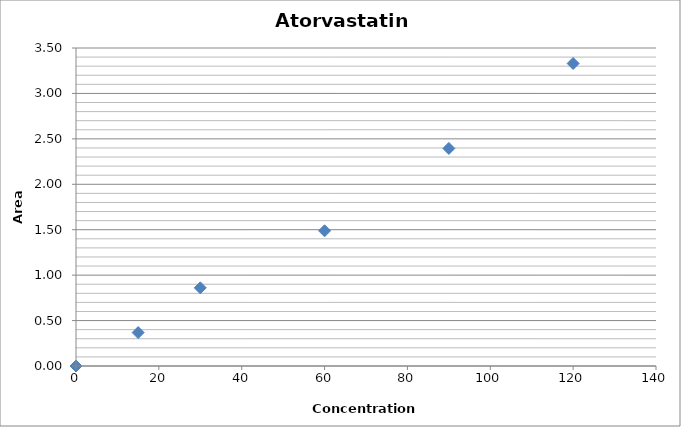
| Category | Series 0 |
|---|---|
| 0.0 | 0 |
| 15.0 | 0.368 |
| 30.0 | 0.86 |
| 60.0 | 1.488 |
| 90.0 | 2.395 |
| 120.0 | 3.329 |